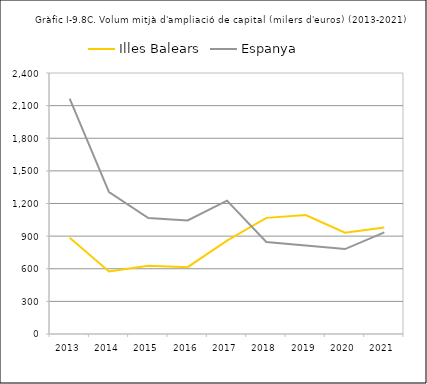
| Category | Illes Balears | Espanya |
|---|---|---|
| 2013.0 | 884.086 | 2165.395 |
| 2014.0 | 575.117 | 1304.105 |
| 2015.0 | 627.2 | 1066.284 |
| 2016.0 | 614.344 | 1044.474 |
| 2017.0 | 859.029 | 1226.339 |
| 2018.0 | 1067.977 | 845.91 |
| 2019.0 | 1094.538 | 813.855 |
| 2020.0 | 931.507 | 780.72 |
| 2021.0 | 979.79 | 934.315 |